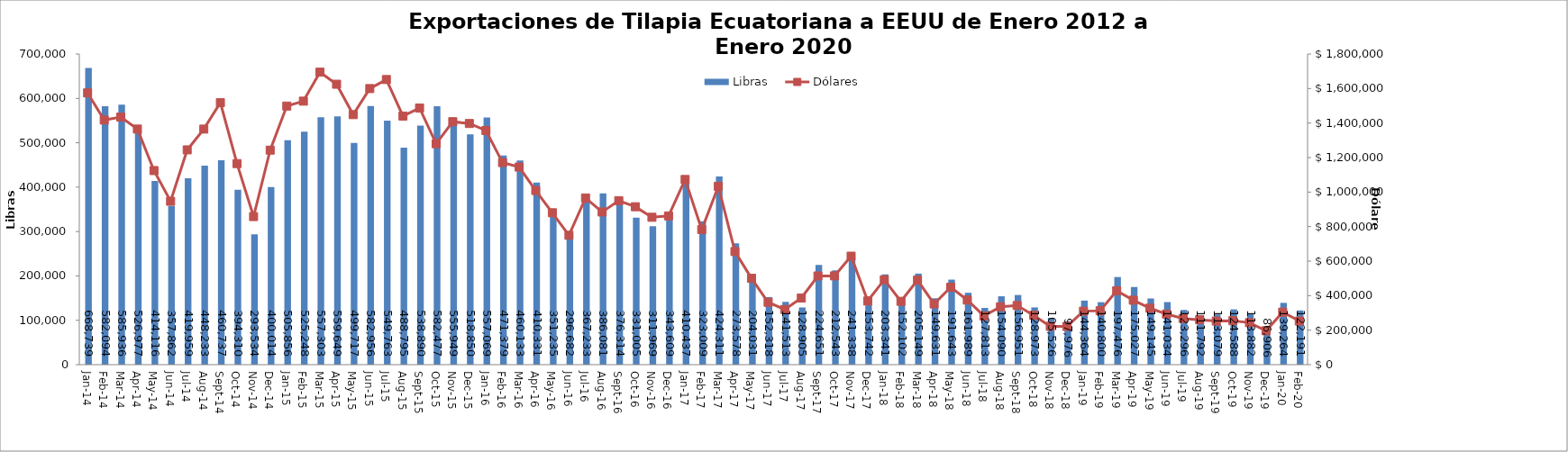
| Category | Libras  |
|---|---|
| 2014-01-01 | 668739 |
| 2014-02-01 | 582093.766 |
| 2014-03-01 | 585936.383 |
| 2014-04-01 | 526976.561 |
| 2014-05-01 | 414116.473 |
| 2014-06-01 | 357861.695 |
| 2014-07-01 | 419958.663 |
| 2014-08-01 | 448233 |
| 2014-09-01 | 460737.149 |
| 2014-10-01 | 394310.347 |
| 2014-11-01 | 293533.672 |
| 2014-12-01 | 400013.647 |
| 2015-01-01 | 505856.493 |
| 2015-02-01 | 525248 |
| 2015-03-01 | 557303.039 |
| 2015-04-01 | 559648.733 |
| 2015-05-01 | 499716.682 |
| 2015-06-01 | 582955.764 |
| 2015-07-01 | 549763.307 |
| 2015-08-01 | 488795.094 |
| 2015-09-01 | 538890.219 |
| 2015-10-01 | 582477.366 |
| 2015-11-01 | 555949.414 |
| 2015-12-01 | 518850.405 |
| 2016-01-01 | 557069.351 |
| 2016-02-01 | 471378.754 |
| 2016-03-01 | 460133.089 |
| 2016-04-01 | 410331.175 |
| 2016-05-01 | 351235 |
| 2016-06-01 | 296682 |
| 2016-07-01 | 367233.45 |
| 2016-08-01 | 386080.575 |
| 2016-09-01 | 376314.197 |
| 2016-10-01 | 331005.258 |
| 2016-11-01 | 311968.537 |
| 2016-12-01 | 343608.956 |
| 2017-01-01 | 410436.996 |
| 2017-02-01 | 323009.174 |
| 2017-03-01 | 424310.544 |
| 2017-04-01 | 273577.632 |
| 2017-05-01 | 204031.321 |
| 2017-06-01 | 152318.019 |
| 2017-07-01 | 141513.274 |
| 2017-08-01 | 128905.167 |
| 2017-09-01 | 224650.945 |
| 2017-10-01 | 212543.281 |
| 2017-11-01 | 241337.562 |
| 2017-12-01 | 153742.19 |
| 2018-01-01 | 203341.281 |
| 2018-02-01 | 152101.968 |
| 2018-03-01 | 205149.053 |
| 2018-04-01 | 149630.611 |
| 2018-05-01 | 191643 |
| 2018-06-01 | 161989 |
| 2018-07-01 | 127813 |
| 2018-08-01 | 154089.894 |
| 2018-09-01 | 156951.494 |
| 2018-10-01 | 128972.628 |
| 2018-11-01 | 105526.466 |
| 2018-12-01 | 97975.634 |
| 2019-01-01 | 144364.157 |
| 2019-02-01 | 140800 |
| 2019-03-01 | 197476 |
| 2019-04-01 | 175027.19 |
| 2019-05-01 | 149144.92 |
| 2019-06-01 | 141034.12 |
| 2019-07-01 | 123295.72 |
| 2019-08-01 | 111792 |
| 2019-09-01 | 113079.347 |
| 2019-10-01 | 124588.429 |
| 2019-11-01 | 113882.151 |
| 2019-12-01 | 86905.72 |
| 2020-01-01 | 139264.124 |
| 2020-02-01 | 122191.168 |